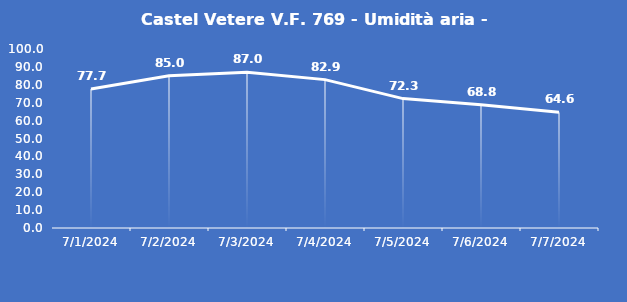
| Category | Castel Vetere V.F. 769 - Umidità aria - Grezzo (%) |
|---|---|
| 7/1/24 | 77.7 |
| 7/2/24 | 85 |
| 7/3/24 | 87 |
| 7/4/24 | 82.9 |
| 7/5/24 | 72.3 |
| 7/6/24 | 68.8 |
| 7/7/24 | 64.6 |